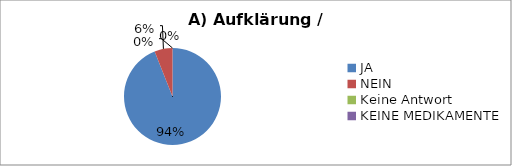
| Category | Series 0 |
|---|---|
| JA | 94 |
| NEIN | 6 |
| Keine Antwort | 0 |
| KEINE MEDIKAMENTE | 0 |